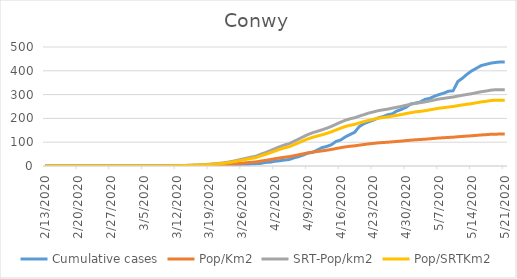
| Category | Cumulative cases | Pop/Km2 | SRT-Pop/km2 | Pop/SRTKm2 |
|---|---|---|---|---|
| 5/21/20 | 437 | 133.942 | 320.383 | 276.479 |
| 5/20/20 | 437 | 133.942 | 320.383 | 276.479 |
| 5/19/20 | 435 | 133.91 | 320.307 | 276.414 |
| 5/18/20 | 432 | 133.176 | 318.551 | 274.899 |
| 5/17/20 | 427 | 131.613 | 314.813 | 271.673 |
| 5/16/20 | 422 | 130.449 | 312.029 | 269.27 |
| 5/15/20 | 411 | 128.813 | 308.115 | 265.893 |
| 5/14/20 | 400 | 126.999 | 303.775 | 262.147 |
| 5/13/20 | 386 | 125.74 | 300.765 | 259.55 |
| 5/12/20 | 369 | 124.293 | 297.303 | 256.562 |
| 5/11/20 | 355 | 122.856 | 293.866 | 253.596 |
| 5/10/20 | 316 | 121.073 | 289.601 | 249.916 |
| 5/9/20 | 314 | 120.035 | 287.118 | 247.773 |
| 5/8/20 | 306 | 118.734 | 284.007 | 245.088 |
| 5/7/20 | 300 | 117.685 | 281.498 | 242.923 |
| 5/6/20 | 293 | 115.955 | 277.359 | 239.351 |
| 5/5/20 | 284 | 114.224 | 273.22 | 235.779 |
| 5/4/20 | 280 | 112.557 | 269.231 | 232.337 |
| 5/3/20 | 269 | 111.214 | 266.02 | 229.566 |
| 5/2/20 | 264 | 110.229 | 263.661 | 227.531 |
| 5/1/20 | 261 | 108.477 | 259.472 | 223.915 |
| 4/30/20 | 247 | 106.82 | 255.508 | 220.495 |
| 4/29/20 | 238 | 104.806 | 250.692 | 216.338 |
| 4/28/20 | 231 | 103.097 | 246.603 | 212.809 |
| 4/27/20 | 219 | 101.565 | 242.94 | 209.649 |
| 4/26/20 | 215 | 99.845 | 238.826 | 206.098 |
| 4/25/20 | 207 | 98.597 | 235.84 | 203.522 |
| 4/24/20 | 202 | 97.181 | 232.454 | 200.599 |
| 4/23/20 | 193 | 95.01 | 227.261 | 196.118 |
| 4/22/20 | 186 | 92.934 | 222.293 | 191.832 |
| 4/21/20 | 178 | 90.301 | 215.997 | 186.398 |
| 4/20/20 | 166 | 87.648 | 209.65 | 180.92 |
| 4/19/20 | 142 | 84.764 | 202.751 | 174.967 |
| 4/18/20 | 132 | 82.897 | 198.285 | 171.114 |
| 4/17/20 | 122 | 80.348 | 192.189 | 165.853 |
| 4/16/20 | 109 | 76.971 | 184.111 | 158.882 |
| 4/15/20 | 103 | 73.206 | 175.105 | 151.11 |
| 4/14/20 | 89 | 69.483 | 166.2 | 143.424 |
| 4/13/20 | 82 | 66.232 | 158.423 | 136.713 |
| 4/12/20 | 77 | 63.431 | 151.725 | 130.933 |
| 4/11/20 | 67 | 60.883 | 145.628 | 125.672 |
| 4/10/20 | 57 | 58.324 | 139.507 | 120.39 |
| 4/9/20 | 54 | 55.177 | 131.981 | 113.895 |
| 4/8/20 | 46 | 51.087 | 122.197 | 105.452 |
| 4/7/20 | 39 | 47.07 | 112.589 | 97.161 |
| 4/6/20 | 34 | 43.127 | 103.157 | 89.021 |
| 4/5/20 | 27 | 39.152 | 93.649 | 80.816 |
| 4/4/20 | 25 | 36.834 | 88.105 | 76.031 |
| 4/3/20 | 22 | 33.887 | 81.055 | 69.948 |
| 4/2/20 | 20 | 30.489 | 72.927 | 62.934 |
| 4/1/20 | 16 | 26.996 | 64.573 | 55.724 |
| 3/31/20 | 15 | 23.64 | 56.545 | 48.797 |
| 3/30/20 | 11 | 20.798 | 49.747 | 42.93 |
| 3/29/20 | 10 | 17.295 | 41.368 | 35.699 |
| 3/28/20 | 9 | 15.659 | 37.454 | 32.322 |
| 3/27/20 | 7 | 13.918 | 33.29 | 28.728 |
| 3/26/20 | 7 | 11.977 | 28.649 | 24.723 |
| 3/25/20 | 6 | 10.152 | 24.284 | 20.956 |
| 3/24/20 | 3 | 8.233 | 19.693 | 16.994 |
| 3/23/20 | 2 | 6.817 | 16.306 | 14.072 |
| 3/22/20 | 1 | 5.454 | 13.045 | 11.257 |
| 3/21/20 | 1 | 4.657 | 11.139 | 9.612 |
| 3/20/20 | 1 | 3.87 | 9.257 | 7.988 |
| 3/19/20 | 1 | 3.115 | 7.451 | 6.43 |
| 3/18/20 | 1 | 2.486 | 5.946 | 5.131 |
| 3/17/20 | 1 | 2.119 | 5.068 | 4.373 |
| 3/16/20 | 1 | 1.731 | 4.139 | 3.572 |
| 3/15/20 | 1 | 1.374 | 3.286 | 2.836 |
| 3/14/20 | 1 | 1.07 | 2.559 | 2.208 |
| 3/13/20 | 1 | 0.871 | 2.082 | 1.797 |
| 3/12/20 | 1 | 0.587 | 1.405 | 1.212 |
| 3/11/20 | 0 | 0.336 | 0.803 | 0.693 |
| 3/10/20 | 0 | 0.189 | 0.452 | 0.39 |
| 3/9/20 | 0 | 0.073 | 0.176 | 0.152 |
| 3/8/20 | 0 | 0.042 | 0.1 | 0.087 |
| 3/7/20 | 0 | 0.042 | 0.1 | 0.087 |
| 3/6/20 | 0 | 0.021 | 0.05 | 0.043 |
| 3/5/20 | 0 | 0.021 | 0.05 | 0.043 |
| 3/4/20 | 0 | 0.021 | 0.05 | 0.043 |
| 3/3/20 | 0 | 0.01 | 0.025 | 0.022 |
| 3/2/20 | 0 | 0.01 | 0.025 | 0.022 |
| 3/1/20 | 0 | 0.01 | 0.025 | 0.022 |
| 2/29/20 | 0 | 0.01 | 0.025 | 0.022 |
| 2/28/20 | 0 | 0.01 | 0.025 | 0.022 |
| 2/27/20 | 0 | 0.01 | 0.025 | 0.022 |
| 2/26/20 | 0 | 0 | 0 | 0 |
| 2/25/20 | 0 | 0 | 0 | 0 |
| 2/24/20 | 0 | 0 | 0 | 0 |
| 2/23/20 | 0 | 0 | 0 | 0 |
| 2/22/20 | 0 | 0 | 0 | 0 |
| 2/21/20 | 0 | 0 | 0 | 0 |
| 2/20/20 | 0 | 0 | 0 | 0 |
| 2/19/20 | 0 | 0 | 0 | 0 |
| 2/18/20 | 0 | 0 | 0 | 0 |
| 2/17/20 | 0 | 0 | 0 | 0 |
| 2/16/20 | 0 | 0 | 0 | 0 |
| 2/15/20 | 0 | 0 | 0 | 0 |
| 2/14/20 | 0 | 0 | 0 | 0 |
| 2/13/20 | 0 | 0 | 0 | 0 |